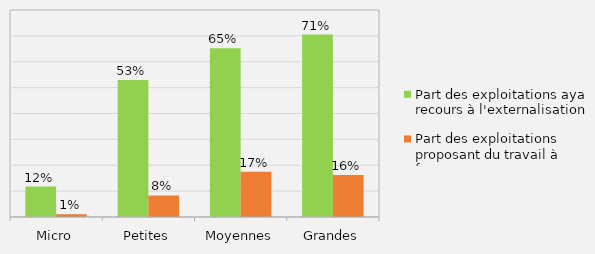
| Category | Part des exploitations ayant recours à l'externalisation | Part des exploitations proposant du travail à façon |
|---|---|---|
| Micro | 0.118 | 0.011 |
| Petites | 0.529 | 0.083 |
| Moyennes | 0.652 | 0.175 |
| Grandes | 0.705 | 0.162 |